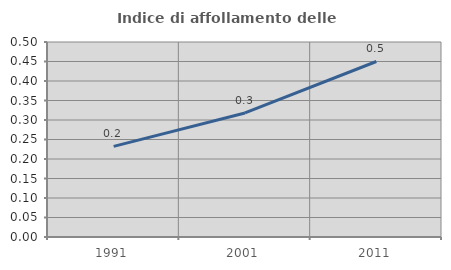
| Category | Indice di affollamento delle abitazioni  |
|---|---|
| 1991.0 | 0.232 |
| 2001.0 | 0.318 |
| 2011.0 | 0.45 |